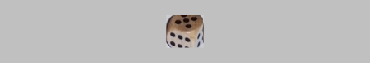
| Category | 1 | 2 | 3 | 4 | 5 | 6 |
|---|---|---|---|---|---|---|
|  | 0 | 0 | 0 | 0 | 0 | 0 |
|  | 0 | 0 | 0 | 0 | 0 | 0 |
|  | 0 | 0 | 0 | 0 | 0 | 0 |
| 5 | 0 | 0 | 0 | 0 | 1 | 0 |